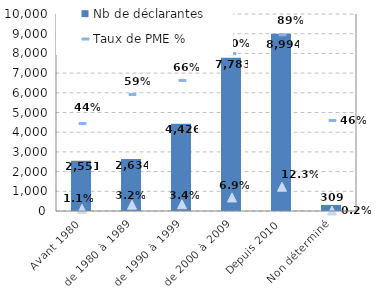
| Category | Nb de déclarantes |
|---|---|
| Avant 1980 | 2551 |
| de 1980 à 1989 | 2634 |
| de 1990 à 1999 | 4426 |
| de 2000 à 2009 | 7783 |
| Depuis 2010 | 8994 |
| Non déterminé | 309 |